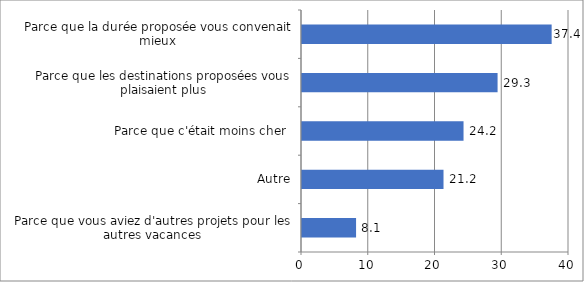
| Category | Series 0 |
|---|---|
| Parce que vous aviez d'autres projets pour les autres vacances | 8.1 |
| Autre | 21.2 |
| Parce que c'était moins cher  | 24.2 |
| Parce que les destinations proposées vous plaisaient plus | 29.3 |
| Parce que la durée proposée vous convenait mieux | 37.4 |